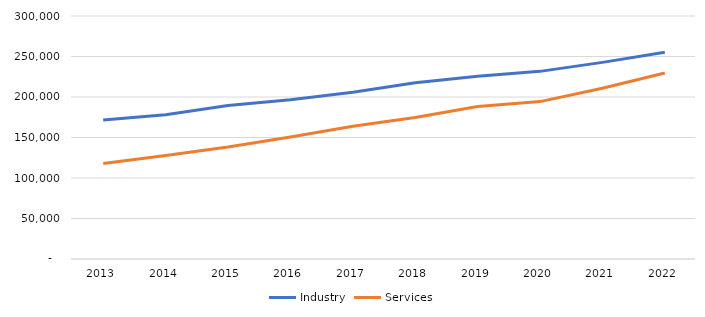
| Category | Industry | Services |
|---|---|---|
| 2013.0 | 171572 | 117782 |
| 2014.0 | 178217 | 127890 |
| 2015.0 | 189444 | 138367 |
| 2016.0 | 196675 | 150692 |
| 2017.0 | 205873 | 163880 |
| 2018.0 | 217678 | 174646 |
| 2019.0 | 225710 | 188270 |
| 2020.0 | 231651 | 194311 |
| 2021.0 | 242763 | 210786 |
| 2022.0 | 255262 | 229716 |